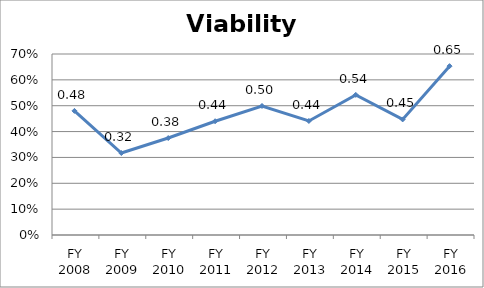
| Category | Viability ratio |
|---|---|
| FY 2016 | 0.653 |
| FY 2015 | 0.447 |
| FY 2014 | 0.542 |
| FY 2013 | 0.441 |
| FY 2012 | 0.499 |
| FY 2011 | 0.44 |
| FY 2010 | 0.375 |
| FY 2009 | 0.317 |
| FY 2008 | 0.48 |